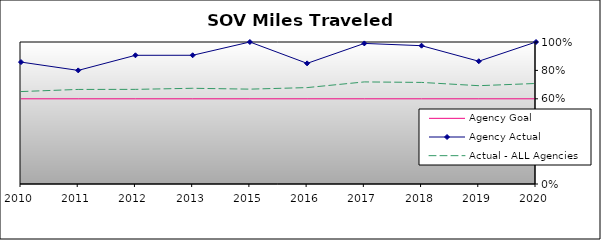
| Category | Agency Goal | Agency Actual | Actual - ALL Agencies |
|---|---|---|---|
| 2010.0 | 0.6 | 0.858 | 0.651 |
| 2011.0 | 0.6 | 0.8 | 0.666 |
| 2012.0 | 0.6 | 0.906 | 0.666 |
| 2013.0 | 0.6 | 0.906 | 0.674 |
| 2015.0 | 0.6 | 1 | 0.668 |
| 2016.0 | 0.6 | 0.85 | 0.679 |
| 2017.0 | 0.6 | 0.99 | 0.719 |
| 2018.0 | 0.6 | 0.974 | 0.715 |
| 2019.0 | 0.6 | 0.865 | 0.692 |
| 2020.0 | 0.6 | 1 | 0.708 |